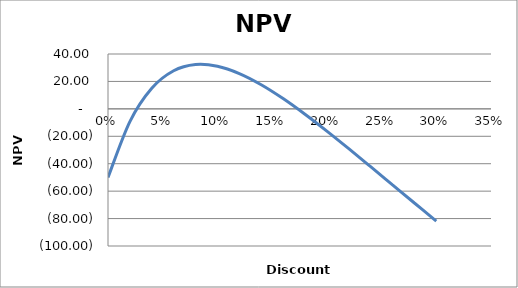
| Category |  25.75  |
|---|---|
| 0.0 | -50 |
| 0.02 | -9.283 |
| 0.04 | 15.03 |
| 0.06 | 27.759 |
| 0.08 | 32.301 |
| 0.1 | 31.061 |
| 0.12 | 25.755 |
| 0.14 | 17.607 |
| 0.16 | 7.501 |
| 0.18 | -3.93 |
| 0.2 | -16.226 |
| 0.22 | -29.057 |
| 0.24 | -42.18 |
| 0.26 | -55.424 |
| 0.28 | -68.663 |
| 0.3 | -81.807 |